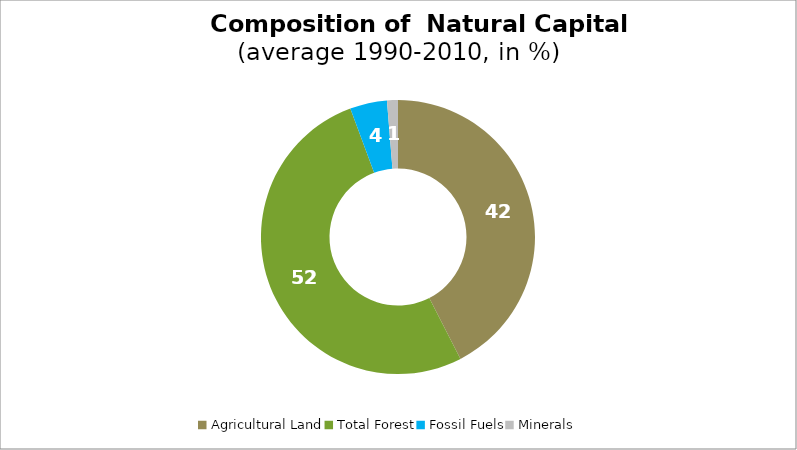
| Category | Series 0 |
|---|---|
| Agricultural Land | 42.46 |
| Total Forest | 51.883 |
| Fossil Fuels | 4.369 |
| Minerals | 1.288 |